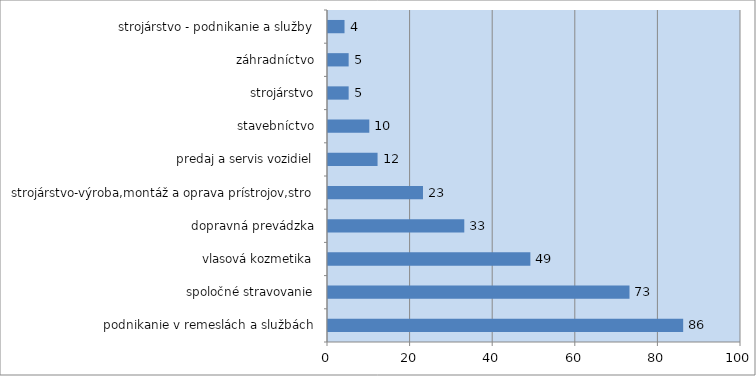
| Category | Series 0 |
|---|---|
| podnikanie v remeslách a službách | 86 |
| spoločné stravovanie | 73 |
| vlasová kozmetika | 49 |
| dopravná prevádzka | 33 |
| strojárstvo-výroba,montáž a oprava prístrojov,stro | 23 |
| predaj a servis vozidiel | 12 |
| stavebníctvo | 10 |
| strojárstvo | 5 |
| záhradníctvo | 5 |
| strojárstvo - podnikanie a služby | 4 |